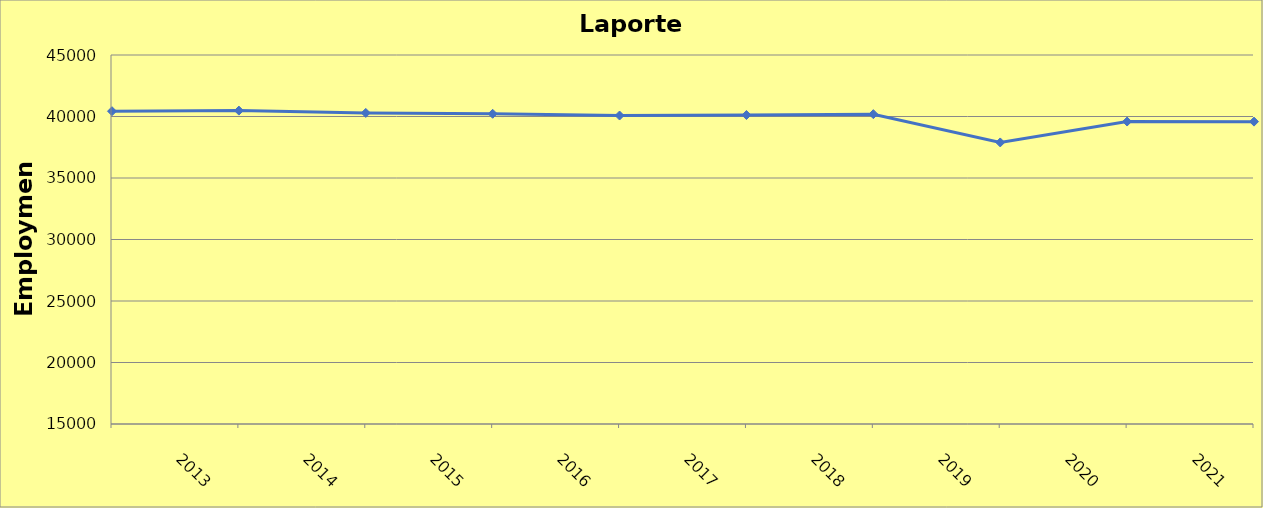
| Category | Laporte County |
|---|---|
| 2013.0 | 40430 |
| 2014.0 | 40480 |
| 2015.0 | 40290 |
| 2016.0 | 40220 |
| 2017.0 | 40080 |
| 2018.0 | 40120 |
| 2019.0 | 40190 |
| 2020.0 | 37890 |
| 2021.0 | 39590 |
| 2022.0 | 39583 |